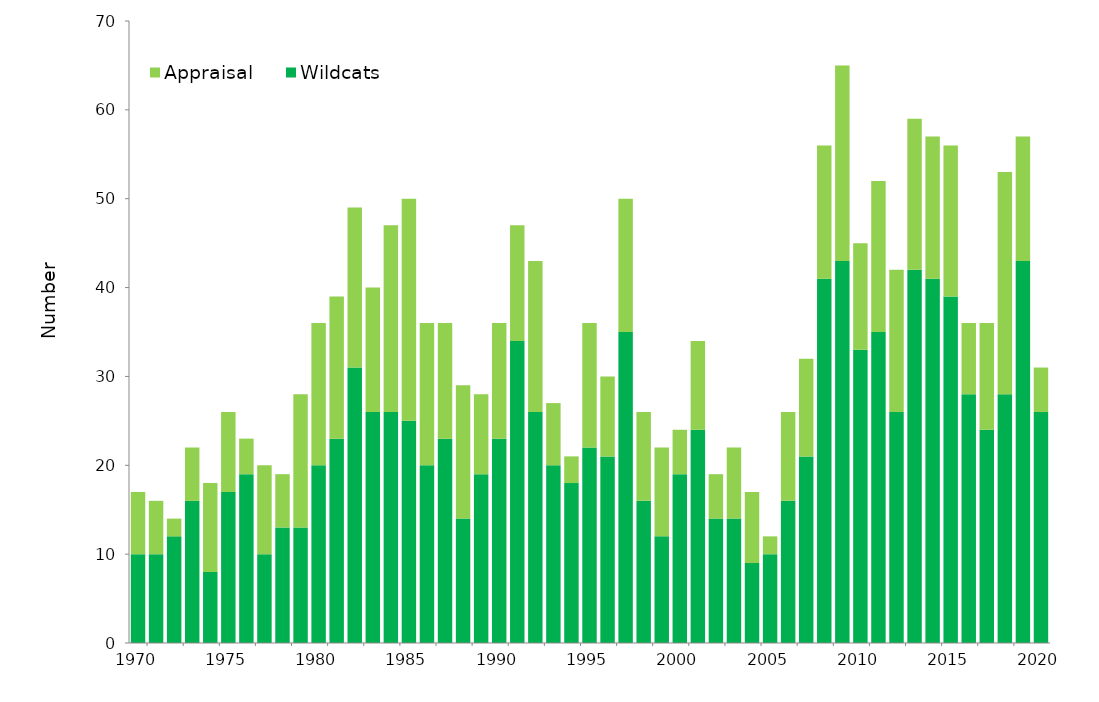
| Category | Wildcats | Appraisal  |
|---|---|---|
| 1970.0 | 10 | 7 |
| 1971.0 | 10 | 6 |
| 1972.0 | 12 | 2 |
| 1973.0 | 16 | 6 |
| 1974.0 | 8 | 10 |
| 1975.0 | 17 | 9 |
| 1976.0 | 19 | 4 |
| 1977.0 | 10 | 10 |
| 1978.0 | 13 | 6 |
| 1979.0 | 13 | 15 |
| 1980.0 | 20 | 16 |
| 1981.0 | 23 | 16 |
| 1982.0 | 31 | 18 |
| 1983.0 | 26 | 14 |
| 1984.0 | 26 | 21 |
| 1985.0 | 25 | 25 |
| 1986.0 | 20 | 16 |
| 1987.0 | 23 | 13 |
| 1988.0 | 14 | 15 |
| 1989.0 | 19 | 9 |
| 1990.0 | 23 | 13 |
| 1991.0 | 34 | 13 |
| 1992.0 | 26 | 17 |
| 1993.0 | 20 | 7 |
| 1994.0 | 18 | 3 |
| 1995.0 | 22 | 14 |
| 1996.0 | 21 | 9 |
| 1997.0 | 35 | 15 |
| 1998.0 | 16 | 10 |
| 1999.0 | 12 | 10 |
| 2000.0 | 19 | 5 |
| 2001.0 | 24 | 10 |
| 2002.0 | 14 | 5 |
| 2003.0 | 14 | 8 |
| 2004.0 | 9 | 8 |
| 2005.0 | 10 | 2 |
| 2006.0 | 16 | 10 |
| 2007.0 | 21 | 11 |
| 2008.0 | 41 | 15 |
| 2009.0 | 43 | 22 |
| 2010.0 | 33 | 12 |
| 2011.0 | 35 | 17 |
| 2012.0 | 26 | 16 |
| 2013.0 | 42 | 17 |
| 2014.0 | 41 | 16 |
| 2015.0 | 39 | 17 |
| 2016.0 | 28 | 8 |
| 2017.0 | 24 | 12 |
| 2018.0 | 28 | 25 |
| 2019.0 | 43 | 14 |
| 2020.0 | 26 | 5 |